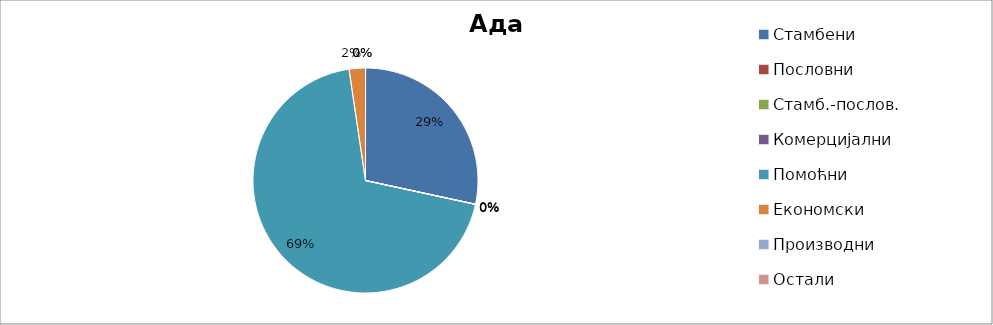
| Category | Ада |
|---|---|
| Стамбени | 1039 |
| Пословни | 1 |
| Стамб.-послов. | 0 |
| Комерцијални | 0 |
| Помоћни | 2536 |
| Економски | 86 |
| Производни | 0 |
| Остали | 0 |